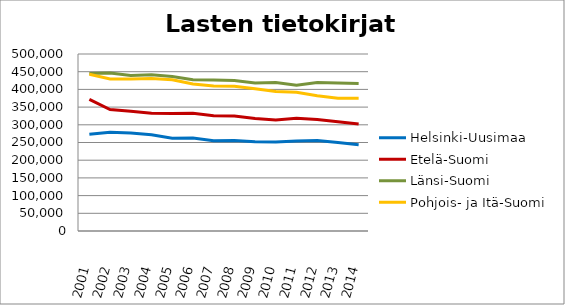
| Category | Helsinki-Uusimaa | Etelä-Suomi | Länsi-Suomi | Pohjois- ja Itä-Suomi |
|---|---|---|---|---|
| 2001.0 | 273358 | 371780 | 444604 | 442704 |
| 2002.0 | 278965 | 343119 | 446221 | 429616 |
| 2003.0 | 276664 | 338599 | 439282 | 429632 |
| 2004.0 | 271837 | 332626 | 441277 | 430926 |
| 2005.0 | 262196 | 331576 | 436504 | 427518 |
| 2006.0 | 262896 | 332762 | 427040 | 415450 |
| 2007.0 | 255281 | 325523 | 426469 | 409397 |
| 2008.0 | 255900 | 324812 | 425295 | 408867 |
| 2009.0 | 252414 | 317561 | 417928 | 401521 |
| 2010.0 | 251575 | 313580 | 419402 | 393762 |
| 2011.0 | 254072 | 318676 | 411918 | 392085 |
| 2012.0 | 255545 | 314710 | 419712 | 382349 |
| 2013.0 | 249730 | 308699 | 418225 | 374772 |
| 2014.0 | 243349 | 302140 | 416542 | 374737 |